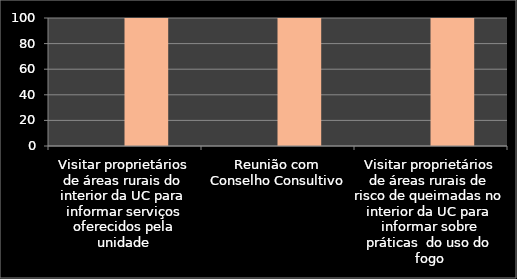
| Category | Inicio % | % |
|---|---|---|
| Visitar proprietários de áreas rurais do interior da UC para informar serviços oferecidos pela unidade | 0 | 100 |
| Reunião com Conselho Consultivo | 0 | 100 |
| Visitar proprietários de áreas rurais de risco de queimadas no interior da UC para informar sobre práticas  do uso do fogo | 0 | 100 |